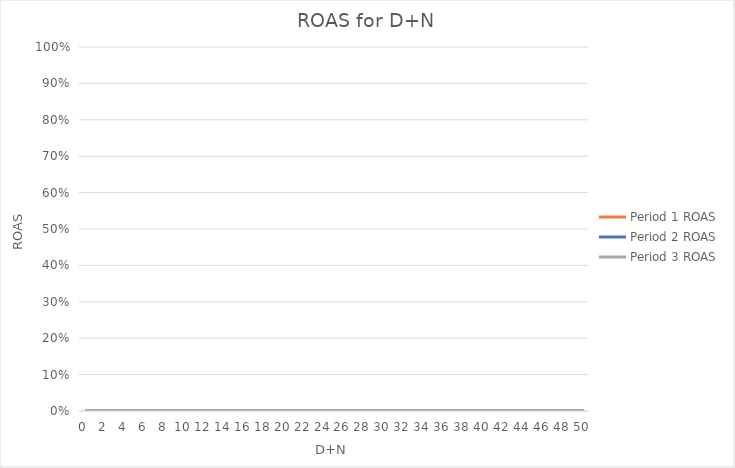
| Category | Period 1 ROAS | Period 2 ROAS | Period 3 ROAS |
|---|---|---|---|
| 0.0 | 0 | 0 | 0 |
| 1.0 | 0 | 0 | 0 |
| 2.0 | 0 | 0 | 0 |
| 3.0 | 0 | 0 | 0 |
| 4.0 | 0 | 0 | 0 |
| 5.0 | 0 | 0 | 0 |
| 6.0 | 0 | 0 | 0 |
| 7.0 | 0 | 0 | 0 |
| 8.0 | 0 | 0 | 0 |
| 9.0 | 0 | 0 | 0 |
| 10.0 | 0 | 0 | 0 |
| 11.0 | 0 | 0 | 0 |
| 12.0 | 0 | 0 | 0 |
| 13.0 | 0 | 0 | 0 |
| 14.0 | 0 | 0 | 0 |
| 15.0 | 0 | 0 | 0 |
| 16.0 | 0 | 0 | 0 |
| 17.0 | 0 | 0 | 0 |
| 18.0 | 0 | 0 | 0 |
| 19.0 | 0 | 0 | 0 |
| 20.0 | 0 | 0 | 0 |
| 21.0 | 0 | 0 | 0 |
| 22.0 | 0 | 0 | 0 |
| 23.0 | 0 | 0 | 0 |
| 24.0 | 0 | 0 | 0 |
| 25.0 | 0 | 0 | 0 |
| 26.0 | 0 | 0 | 0 |
| 27.0 | 0 | 0 | 0 |
| 28.0 | 0 | 0 | 0 |
| 29.0 | 0 | 0 | 0 |
| 30.0 | 0 | 0 | 0 |
| 31.0 | 0 | 0 | 0 |
| 32.0 | 0 | 0 | 0 |
| 33.0 | 0 | 0 | 0 |
| 34.0 | 0 | 0 | 0 |
| 35.0 | 0 | 0 | 0 |
| 36.0 | 0 | 0 | 0 |
| 37.0 | 0 | 0 | 0 |
| 38.0 | 0 | 0 | 0 |
| 39.0 | 0 | 0 | 0 |
| 40.0 | 0 | 0 | 0 |
| 41.0 | 0 | 0 | 0 |
| 42.0 | 0 | 0 | 0 |
| 43.0 | 0 | 0 | 0 |
| 44.0 | 0 | 0 | 0 |
| 45.0 | 0 | 0 | 0 |
| 46.0 | 0 | 0 | 0 |
| 47.0 | 0 | 0 | 0 |
| 48.0 | 0 | 0 | 0 |
| 49.0 | 0 | 0 | 0 |
| 50.0 | 0 | 0 | 0 |